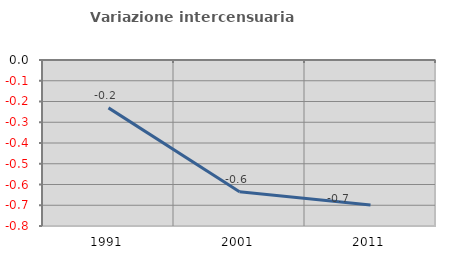
| Category | Variazione intercensuaria annua |
|---|---|
| 1991.0 | -0.231 |
| 2001.0 | -0.635 |
| 2011.0 | -0.699 |